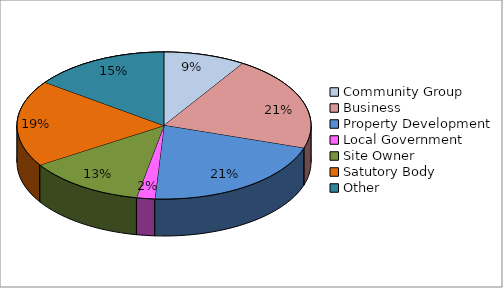
| Category | Total % |
|---|---|
| Community Group | 0.09 |
| Business | 0.21 |
| Property Development | 0.21 |
| Local Government | 0.02 |
| Site Owner | 0.13 |
| Satutory Body | 0.19 |
| Other | 0.15 |